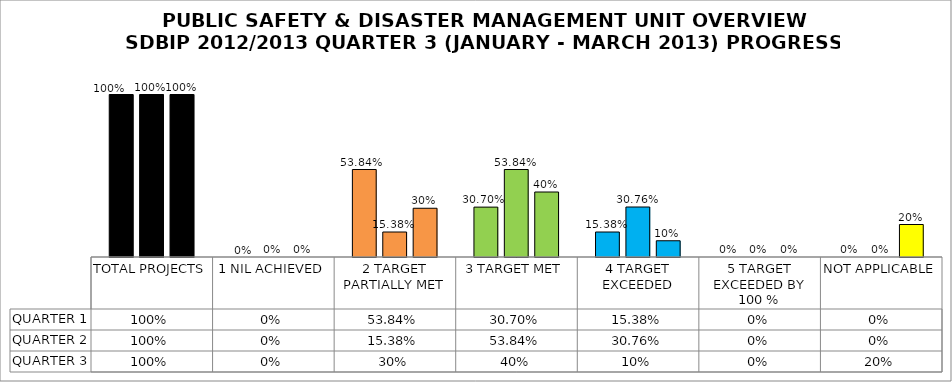
| Category | QUARTER 1 | QUARTER 2 | QUARTER 3 |
|---|---|---|---|
| TOTAL PROJECTS | 1 | 1 | 1 |
| 1 NIL ACHIEVED | 0 | 0 | 0 |
| 2 TARGET PARTIALLY MET | 0.538 | 0.154 | 0.3 |
| 3 TARGET MET | 0.307 | 0.538 | 0.4 |
| 4 TARGET EXCEEDED | 0.154 | 0.308 | 0.1 |
| 5 TARGET EXCEEDED BY 100 % | 0 | 0 | 0 |
| NOT APPLICABLE | 0 | 0 | 0.2 |